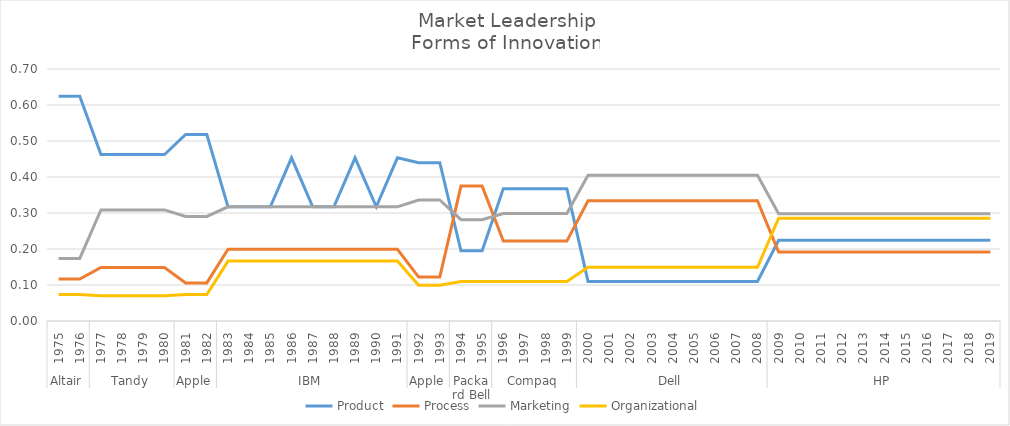
| Category | Product | Process | Marketing | Organizational |
|---|---|---|---|---|
| 0 | 0.624 | 0.117 | 0.174 | 0.073 |
| 1 | 0.624 | 0.117 | 0.174 | 0.073 |
| 2 | 0.462 | 0.149 | 0.309 | 0.07 |
| 3 | 0.462 | 0.149 | 0.309 | 0.07 |
| 4 | 0.462 | 0.149 | 0.309 | 0.07 |
| 5 | 0.462 | 0.149 | 0.309 | 0.07 |
| 6 | 0.518 | 0.106 | 0.29 | 0.074 |
| 7 | 0.518 | 0.106 | 0.29 | 0.074 |
| 8 | 0.317 | 0.199 | 0.317 | 0.166 |
| 9 | 0.317 | 0.199 | 0.317 | 0.166 |
| 10 | 0.317 | 0.199 | 0.317 | 0.166 |
| 11 | 0.453 | 0.199 | 0.317 | 0.166 |
| 12 | 0.317 | 0.199 | 0.317 | 0.166 |
| 13 | 0.317 | 0.199 | 0.317 | 0.166 |
| 14 | 0.453 | 0.199 | 0.317 | 0.166 |
| 15 | 0.317 | 0.199 | 0.317 | 0.166 |
| 16 | 0.453 | 0.199 | 0.317 | 0.166 |
| 17 | 0.44 | 0.122 | 0.336 | 0.099 |
| 18 | 0.44 | 0.122 | 0.336 | 0.099 |
| 19 | 0.195 | 0.375 | 0.282 | 0.11 |
| 20 | 0.195 | 0.375 | 0.282 | 0.11 |
| 21 | 0.368 | 0.222 | 0.299 | 0.11 |
| 22 | 0.368 | 0.222 | 0.299 | 0.11 |
| 23 | 0.368 | 0.222 | 0.299 | 0.11 |
| 24 | 0.368 | 0.222 | 0.299 | 0.11 |
| 25 | 0.11 | 0.334 | 0.405 | 0.149 |
| 26 | 0.11 | 0.334 | 0.405 | 0.149 |
| 27 | 0.11 | 0.334 | 0.405 | 0.149 |
| 28 | 0.11 | 0.334 | 0.405 | 0.149 |
| 29 | 0.11 | 0.334 | 0.405 | 0.149 |
| 30 | 0.11 | 0.334 | 0.405 | 0.149 |
| 31 | 0.11 | 0.334 | 0.405 | 0.149 |
| 32 | 0.11 | 0.334 | 0.405 | 0.149 |
| 33 | 0.11 | 0.334 | 0.405 | 0.149 |
| 34 | 0.224 | 0.192 | 0.298 | 0.286 |
| 35 | 0.224 | 0.192 | 0.298 | 0.286 |
| 36 | 0.224 | 0.192 | 0.298 | 0.286 |
| 37 | 0.224 | 0.192 | 0.298 | 0.286 |
| 38 | 0.224 | 0.192 | 0.298 | 0.286 |
| 39 | 0.224 | 0.192 | 0.298 | 0.286 |
| 40 | 0.224 | 0.192 | 0.298 | 0.286 |
| 41 | 0.224 | 0.192 | 0.298 | 0.286 |
| 42 | 0.224 | 0.192 | 0.298 | 0.286 |
| 43 | 0.224 | 0.192 | 0.298 | 0.286 |
| 44 | 0.224 | 0.192 | 0.298 | 0.286 |